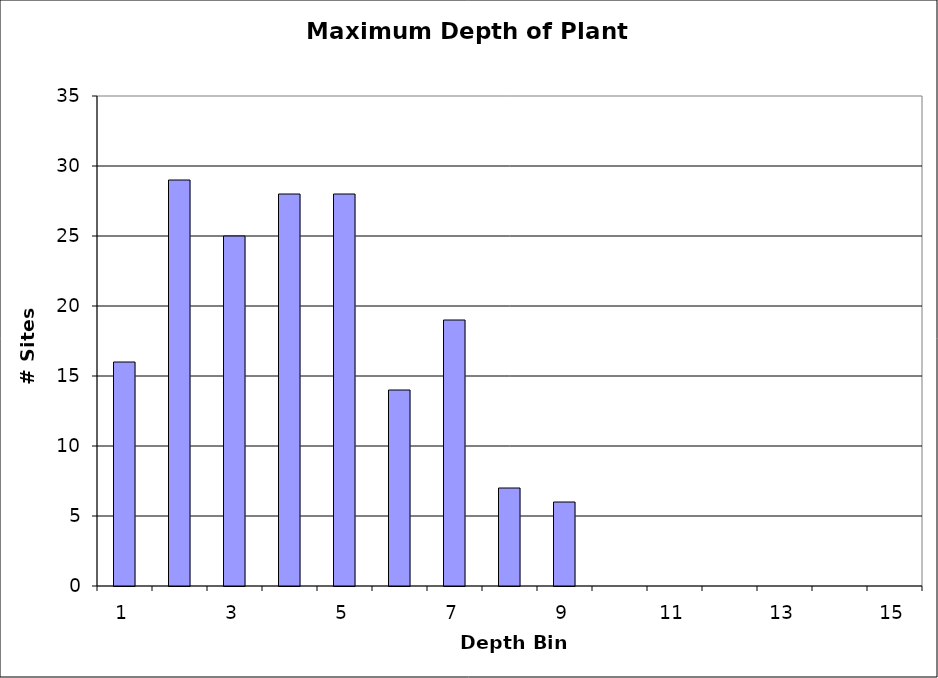
| Category | Series 0 |
|---|---|
| 1.0 | 16 |
| 2.0 | 29 |
| 3.0 | 25 |
| 4.0 | 28 |
| 5.0 | 28 |
| 6.0 | 14 |
| 7.0 | 19 |
| 8.0 | 7 |
| 9.0 | 6 |
| 10.0 | 0 |
| 11.0 | 0 |
| 12.0 | 0 |
| 13.0 | 0 |
| 14.0 | 0 |
| 15.0 | 0 |